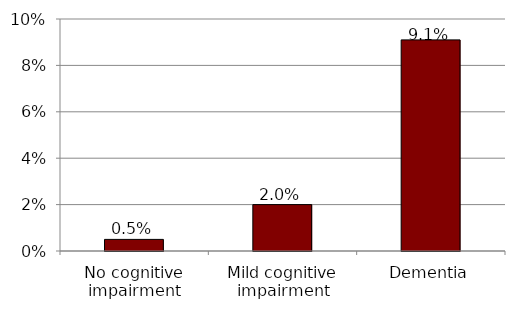
| Category | Series 0 |
|---|---|
| No cognitive impairment | 0.005 |
| Mild cognitive impairment | 0.02 |
| Dementia | 0.091 |